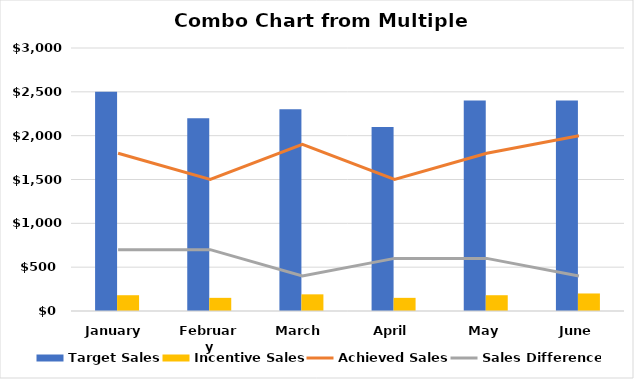
| Category | Target Sales | Incentive Sales |
|---|---|---|
| January | 2500 | 180 |
| February | 2200 | 150 |
| March | 2300 | 190 |
| April | 2100 | 150 |
| May | 2400 | 180 |
| June | 2400 | 200 |